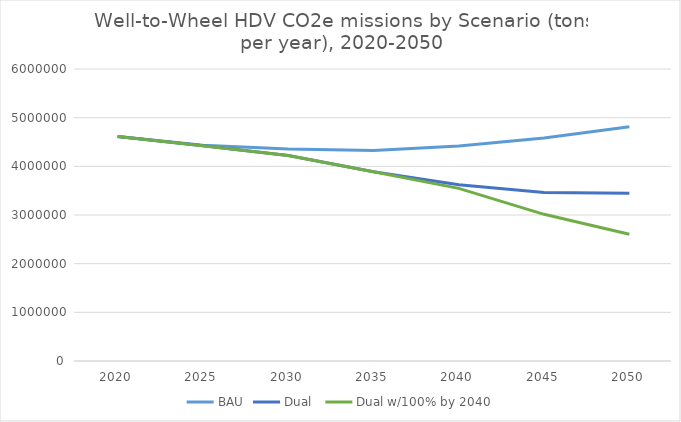
| Category | BAU | Dual  | Dual w/100% by 2040 |
|---|---|---|---|
| 2020.0 | 4611638.912 | 4611638.912 | 4611638.912 |
| 2025.0 | 4432029.515 | 4423824.181 | 4423824.181 |
| 2030.0 | 4357589.943 | 4220945.796 | 4220945.796 |
| 2035.0 | 4323012.317 | 3890566.96 | 3890566.96 |
| 2040.0 | 4420275.741 | 3621377.043 | 3547047.484 |
| 2045.0 | 4580183.745 | 3463435.819 | 3013911.472 |
| 2050.0 | 4812824.378 | 3447787.84 | 2605980.78 |